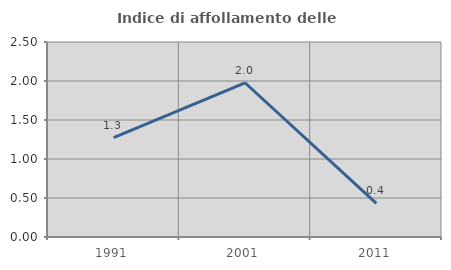
| Category | Indice di affollamento delle abitazioni  |
|---|---|
| 1991.0 | 1.274 |
| 2001.0 | 1.977 |
| 2011.0 | 0.431 |